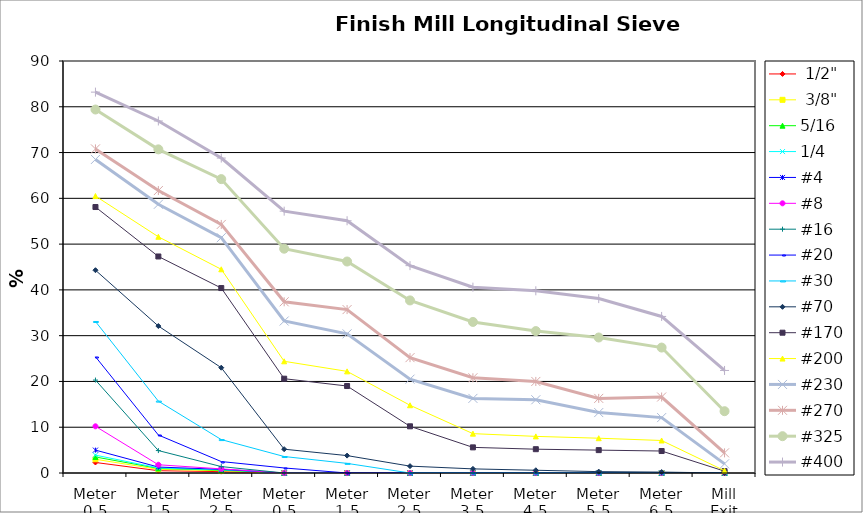
| Category |  1/2" |  3/8" | 5/16 | 1/4 | #4 | #8 | #16 | #20 | #30 | #70 | #170 | #200 | #230 | #270 | #325 | #400 |
|---|---|---|---|---|---|---|---|---|---|---|---|---|---|---|---|---|
| Meter 0.5 | 2.3 | 3 | 3.5 | 3.9 | 5 | 10.2 | 20.3 | 25.4 | 33.1 | 44.3 | 58.1 | 60.5 | 68.5 | 70.8 | 79.4 | 83.2 |
| Meter 1.5 | 0.5 | 0.8 | 1 | 1.1 | 1.3 | 1.8 | 4.9 | 8.3 | 15.7 | 32.1 | 47.3 | 51.6 | 58.7 | 61.7 | 70.7 | 76.9 |
| Meter 2.5 | 0.3 | 0.5 | 0.6 | 0.7 | 0.8 | 0.9 | 1.4 | 2.5 | 7.3 | 23 | 40.4 | 44.5 | 51.4 | 54.3 | 64.2 | 68.8 |
| Meter 0.5 | 0 | 0 | 0 | 0 | 0 | 0 | 0 | 1.1 | 3.6 | 5.2 | 20.6 | 24.4 | 33.2 | 37.4 | 49 | 57.2 |
| Meter 1.5 | 0 | 0 | 0 | 0 | 0 | 0 | 0 | 0 | 2.1 | 3.8 | 19 | 22.2 | 30.4 | 35.7 | 46.2 | 55.1 |
| Meter 2.5 | 0 | 0 | 0 | 0 | 0 | 0 | 0 | 0 | 0 | 1.5 | 10.2 | 14.8 | 20.5 | 25.2 | 37.7 | 45.3 |
| Meter 3.5 | 0 | 0 | 0 | 0 | 0 | 0 | 0 | 0 | 0 | 0.9 | 5.6 | 8.6 | 16.3 | 20.8 | 33 | 40.6 |
| Meter 4.5 | 0 | 0 | 0 | 0 | 0 | 0 | 0 | 0 | 0 | 0.6 | 5.2 | 8 | 16 | 20 | 31 | 39.8 |
| Meter 5.5 | 0 | 0 | 0 | 0 | 0 | 0 | 0 | 0 | 0 | 0.3 | 5 | 7.6 | 13.2 | 16.3 | 29.6 | 38.1 |
| Meter 6.5 | 0 | 0 | 0 | 0 | 0 | 0 | 0 | 0 | 0 | 0.2 | 4.8 | 7.1 | 12.1 | 16.6 | 27.4 | 34.2 |
| Mill Exit | 0 | 0 | 0 | 0 | 0 | 0 | 0 | 0 | 0 | 0 | 0.4 | 0.5 | 2 | 4.4 | 13.5 | 22.4 |